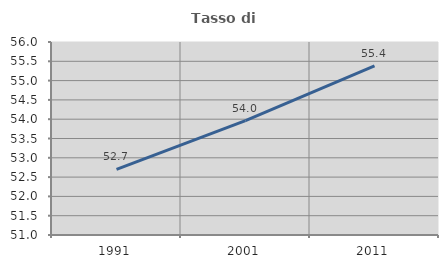
| Category | Tasso di occupazione   |
|---|---|
| 1991.0 | 52.698 |
| 2001.0 | 53.962 |
| 2011.0 | 55.382 |